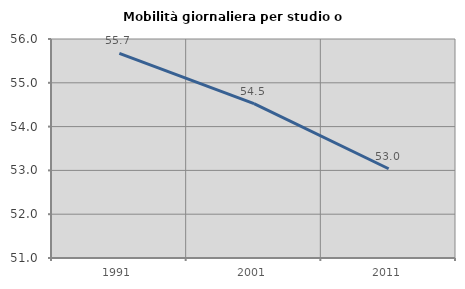
| Category | Mobilità giornaliera per studio o lavoro |
|---|---|
| 1991.0 | 55.673 |
| 2001.0 | 54.525 |
| 2011.0 | 53.038 |